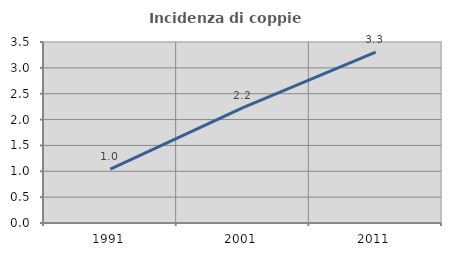
| Category | Incidenza di coppie miste |
|---|---|
| 1991.0 | 1.043 |
| 2001.0 | 2.229 |
| 2011.0 | 3.302 |